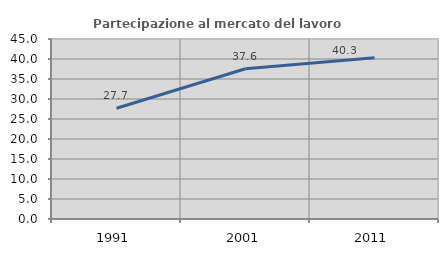
| Category | Partecipazione al mercato del lavoro  femminile |
|---|---|
| 1991.0 | 27.677 |
| 2001.0 | 37.569 |
| 2011.0 | 40.286 |